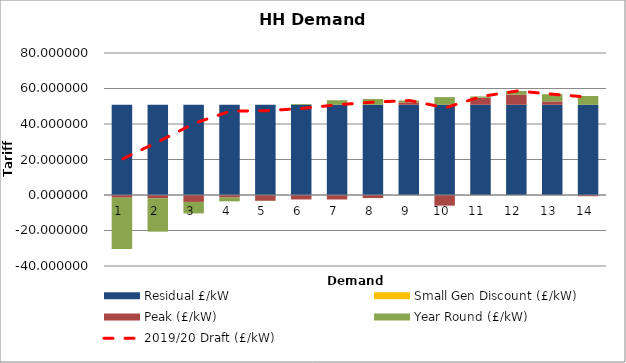
| Category | Residual £/kW | Small Gen Discount (£/kW) | Peak (£/kW) | Year Round (£/kW) |
|---|---|---|---|---|
| 1.0 | 50.823 | 0 | -1.524 | -28.904 |
| 2.0 | 50.823 | 0 | -1.801 | -18.843 |
| 3.0 | 50.823 | 0 | -3.901 | -6.472 |
| 4.0 | 50.823 | 0 | -1.432 | -2.135 |
| 5.0 | 50.823 | 0 | -3.269 | -0.091 |
| 6.0 | 50.823 | 0 | -2.505 | 0.452 |
| 7.0 | 50.823 | 0 | -2.526 | 2.566 |
| 8.0 | 50.823 | 0 | -1.718 | 3.248 |
| 9.0 | 50.823 | 0 | 1.367 | 1.022 |
| 10.0 | 50.823 | 0 | -5.996 | 4.323 |
| 11.0 | 50.823 | 0 | 3.957 | 0.755 |
| 12.0 | 50.823 | 0 | 5.735 | 2.042 |
| 13.0 | 50.823 | 0 | 1.918 | 4.021 |
| 14.0 | 50.823 | 0 | -0.68 | 4.968 |